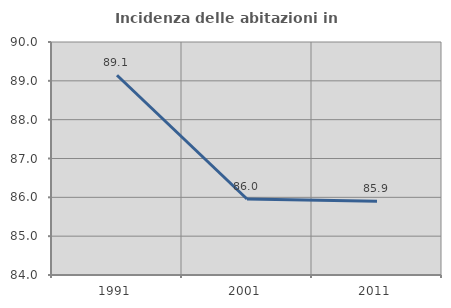
| Category | Incidenza delle abitazioni in proprietà  |
|---|---|
| 1991.0 | 89.143 |
| 2001.0 | 85.957 |
| 2011.0 | 85.9 |